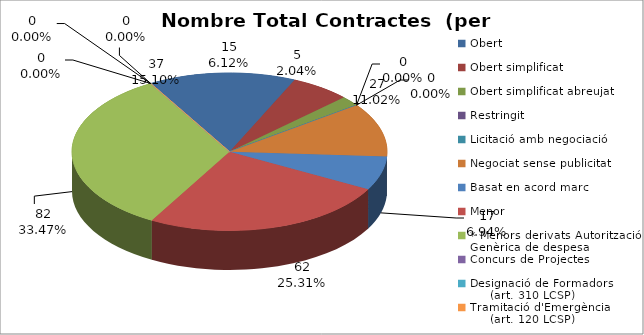
| Category | Nombre Total Contractes |
|---|---|
| Obert | 37 |
| Obert simplificat | 15 |
| Obert simplificat abreujat | 5 |
| Restringit | 0 |
| Licitació amb negociació | 0 |
| Negociat sense publicitat | 27 |
| Basat en acord marc | 17 |
| Menor | 62 |
| * Menors derivats Autorització Genèrica de despesa | 82 |
| Concurs de Projectes | 0 |
| Designació de Formadors
     (art. 310 LCSP) | 0 |
| Tramitació d'Emergència
     (art. 120 LCSP) | 0 |